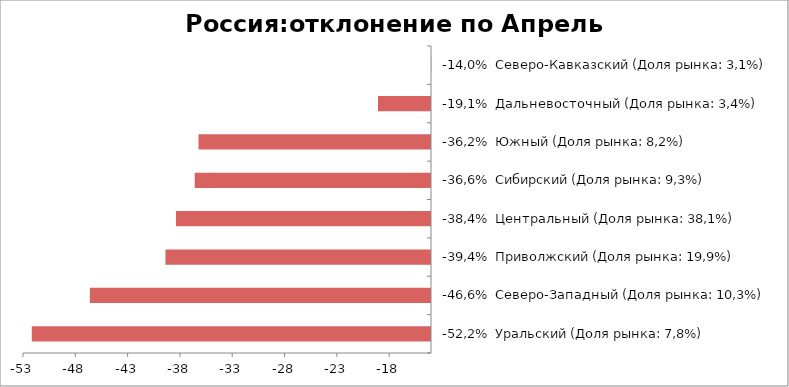
| Category | Россия:отклонение по Апрель 2015-2014 |
|---|---|
| -52,2%  Уральский (Доля рынка: 7,8%) | -52.161 |
| -46,6%  Северо-Западный (Доля рынка: 10,3%) | -46.607 |
| -39,4%  Приволжский (Доля рынка: 19,9%) | -39.382 |
| -38,4%  Центральный (Доля рынка: 38,1%) | -38.371 |
| -36,6%  Сибирский (Доля рынка: 9,3%) | -36.585 |
| -36,2%  Южный (Доля рынка: 8,2%) | -36.222 |
| -19,1%  Дальневосточный (Доля рынка: 3,4%) | -19.065 |
| -14,0%  Северо-Кавказский (Доля рынка: 3,1%) | -13.978 |